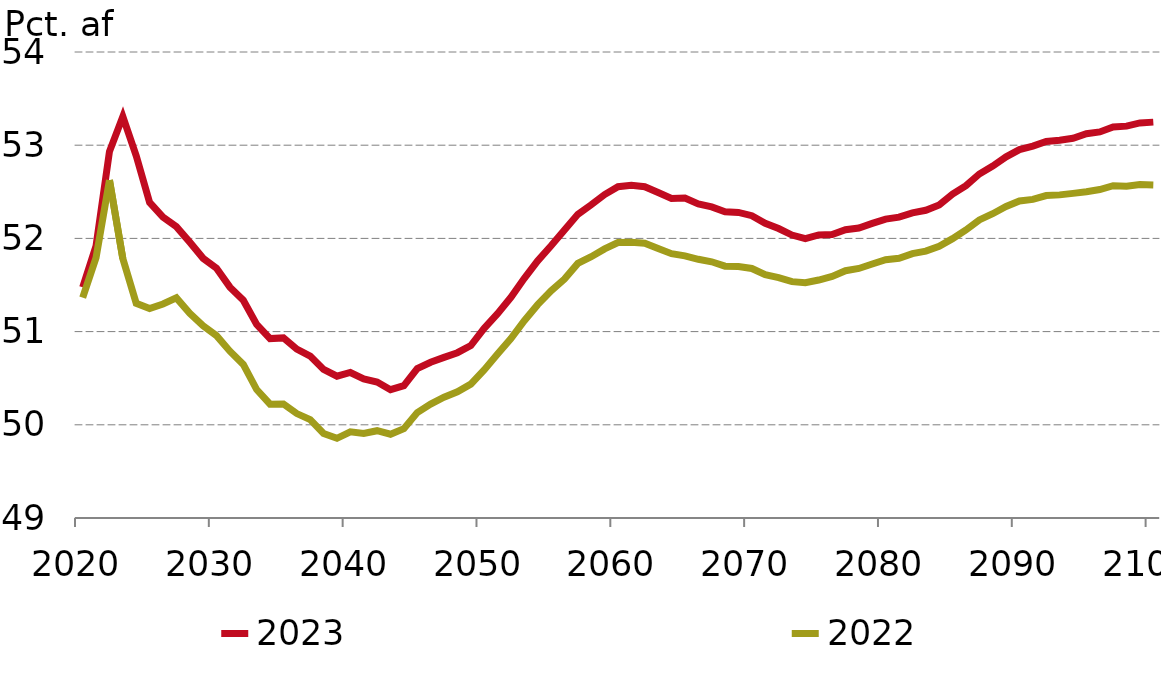
| Category |  2023 |  2022 |
|---|---|---|
| 0 | 51.476 | 51.365 |
| 1 | 51.921 | 51.793 |
| 2 | 52.931 | 52.624 |
| 3 | 53.308 | 51.783 |
| 4 | 52.887 | 51.304 |
| 5 | 52.386 | 51.247 |
| 6 | 52.228 | 51.296 |
| 7 | 52.127 | 51.362 |
| 8 | 51.96 | 51.197 |
| 9 | 51.786 | 51.063 |
| 10 | 51.68 | 50.957 |
| 11 | 51.477 | 50.79 |
| 12 | 51.336 | 50.648 |
| 13 | 51.077 | 50.378 |
| 14 | 50.925 | 50.221 |
| 15 | 50.932 | 50.224 |
| 16 | 50.811 | 50.121 |
| 17 | 50.737 | 50.055 |
| 18 | 50.595 | 49.907 |
| 19 | 50.522 | 49.855 |
| 20 | 50.561 | 49.925 |
| 21 | 50.493 | 49.906 |
| 22 | 50.46 | 49.937 |
| 23 | 50.377 | 49.899 |
| 24 | 50.42 | 49.958 |
| 25 | 50.602 | 50.131 |
| 26 | 50.671 | 50.223 |
| 27 | 50.723 | 50.296 |
| 28 | 50.774 | 50.355 |
| 29 | 50.85 | 50.437 |
| 30 | 51.035 | 50.589 |
| 31 | 51.193 | 50.759 |
| 32 | 51.368 | 50.925 |
| 33 | 51.572 | 51.117 |
| 34 | 51.76 | 51.289 |
| 35 | 51.92 | 51.438 |
| 36 | 52.09 | 51.563 |
| 37 | 52.258 | 51.732 |
| 38 | 52.361 | 51.804 |
| 39 | 52.47 | 51.887 |
| 40 | 52.554 | 51.956 |
| 41 | 52.57 | 51.959 |
| 42 | 52.555 | 51.948 |
| 43 | 52.492 | 51.89 |
| 44 | 52.429 | 51.836 |
| 45 | 52.433 | 51.813 |
| 46 | 52.371 | 51.776 |
| 47 | 52.338 | 51.749 |
| 48 | 52.286 | 51.702 |
| 49 | 52.279 | 51.698 |
| 50 | 52.244 | 51.677 |
| 51 | 52.163 | 51.61 |
| 52 | 52.105 | 51.579 |
| 53 | 52.036 | 51.536 |
| 54 | 51.999 | 51.525 |
| 55 | 52.037 | 51.553 |
| 56 | 52.041 | 51.591 |
| 57 | 52.094 | 51.654 |
| 58 | 52.112 | 51.678 |
| 59 | 52.161 | 51.726 |
| 60 | 52.207 | 51.772 |
| 61 | 52.228 | 51.787 |
| 62 | 52.274 | 51.836 |
| 63 | 52.302 | 51.864 |
| 64 | 52.359 | 51.916 |
| 65 | 52.476 | 51.997 |
| 66 | 52.566 | 52.09 |
| 67 | 52.691 | 52.198 |
| 68 | 52.776 | 52.265 |
| 69 | 52.875 | 52.342 |
| 70 | 52.952 | 52.401 |
| 71 | 52.99 | 52.418 |
| 72 | 53.04 | 52.459 |
| 73 | 53.054 | 52.467 |
| 74 | 53.074 | 52.483 |
| 75 | 53.123 | 52.501 |
| 76 | 53.142 | 52.525 |
| 77 | 53.196 | 52.566 |
| 78 | 53.205 | 52.561 |
| 79 | 53.239 | 52.578 |
| 80 | 53.248 | 52.574 |